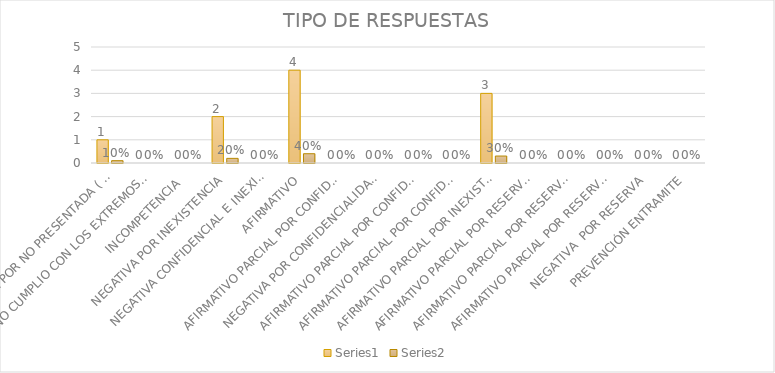
| Category | Series 4 | Series 5 |
|---|---|---|
| SE TIENE POR NO PRESENTADA ( NO CUMPLIÓ PREVENCIÓN) | 1 | 0.1 |
| NO CUMPLIO CON LOS EXTREMOS DEL ARTÍCULO 79 (REQUISITOS) | 0 | 0 |
| INCOMPETENCIA  | 0 | 0 |
| NEGATIVA POR INEXISTENCIA | 2 | 0.2 |
| NEGATIVA CONFIDENCIAL E INEXISTENTE | 0 | 0 |
| AFIRMATIVO | 4 | 0.4 |
| AFIRMATIVO PARCIAL POR CONFIDENCIALIDAD  | 0 | 0 |
| NEGATIVA POR CONFIDENCIALIDAD Y RESERVADA | 0 | 0 |
| AFIRMATIVO PARCIAL POR CONFIDENCIALIDAD E INEXISTENCIA | 0 | 0 |
| AFIRMATIVO PARCIAL POR CONFIDENCIALIDAD, RESERVA E INEXISTENCIA | 0 | 0 |
| AFIRMATIVO PARCIAL POR INEXISTENCIA | 3 | 0.3 |
| AFIRMATIVO PARCIAL POR RESERVA | 0 | 0 |
| AFIRMATIVO PARCIAL POR RESERVA Y CONFIDENCIALIDAD | 0 | 0 |
| AFIRMATIVO PARCIAL POR RESERVA E INEXISTENCIA | 0 | 0 |
| NEGATIVA  POR RESERVA | 0 | 0 |
| PREVENCIÓN ENTRAMITE | 0 | 0 |